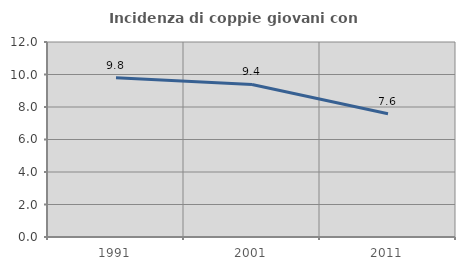
| Category | Incidenza di coppie giovani con figli |
|---|---|
| 1991.0 | 9.796 |
| 2001.0 | 9.39 |
| 2011.0 | 7.589 |